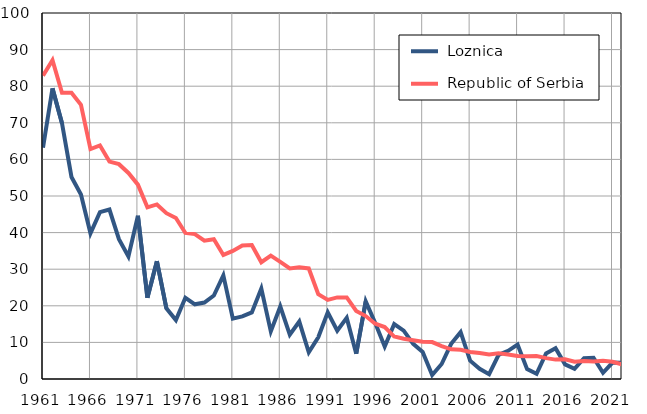
| Category |  Loznica |  Republic of Serbia |
|---|---|---|
| 1961.0 | 63.2 | 82.9 |
| 1962.0 | 79.4 | 87.1 |
| 1963.0 | 69.9 | 78.2 |
| 1964.0 | 55.2 | 78.2 |
| 1965.0 | 50.4 | 74.9 |
| 1966.0 | 39.8 | 62.8 |
| 1967.0 | 45.6 | 63.8 |
| 1968.0 | 46.3 | 59.4 |
| 1969.0 | 38.2 | 58.7 |
| 1970.0 | 33.5 | 56.3 |
| 1971.0 | 44.6 | 53.1 |
| 1972.0 | 22.2 | 46.9 |
| 1973.0 | 32.2 | 47.7 |
| 1974.0 | 19.3 | 45.3 |
| 1975.0 | 16.1 | 44 |
| 1976.0 | 22.2 | 39.9 |
| 1977.0 | 20.4 | 39.6 |
| 1978.0 | 20.9 | 37.8 |
| 1979.0 | 22.8 | 38.2 |
| 1980.0 | 28.3 | 33.9 |
| 1981.0 | 16.5 | 35 |
| 1982.0 | 17.1 | 36.5 |
| 1983.0 | 18.2 | 36.6 |
| 1984.0 | 24.7 | 31.9 |
| 1985.0 | 13 | 33.7 |
| 1986.0 | 19.8 | 32 |
| 1987.0 | 12.1 | 30.2 |
| 1988.0 | 15.7 | 30.5 |
| 1989.0 | 7.3 | 30.2 |
| 1990.0 | 11.4 | 23.2 |
| 1991.0 | 18.2 | 21.6 |
| 1992.0 | 13.2 | 22.3 |
| 1993.0 | 16.7 | 22.3 |
| 1994.0 | 6.9 | 18.6 |
| 1995.0 | 21.2 | 17.2 |
| 1996.0 | 15.3 | 15.1 |
| 1997.0 | 8.9 | 14.2 |
| 1998.0 | 15 | 11.6 |
| 1999.0 | 13.2 | 11 |
| 2000.0 | 9.6 | 10.6 |
| 2001.0 | 7.4 | 10.2 |
| 2002.0 | 1.1 | 10.1 |
| 2003.0 | 4.1 | 9 |
| 2004.0 | 9.6 | 8.1 |
| 2005.0 | 12.8 | 8 |
| 2006.0 | 5 | 7.4 |
| 2007.0 | 2.8 | 7.1 |
| 2008.0 | 1.3 | 6.7 |
| 2009.0 | 6.6 | 7 |
| 2010.0 | 7.7 | 6.7 |
| 2011.0 | 9.4 | 6.3 |
| 2012.0 | 2.7 | 6.2 |
| 2013.0 | 1.4 | 6.3 |
| 2014.0 | 7 | 5.7 |
| 2015.0 | 8.4 | 5.3 |
| 2016.0 | 4 | 5.4 |
| 2017.0 | 2.8 | 4.7 |
| 2018.0 | 5.7 | 4.9 |
| 2019.0 | 5.8 | 4.8 |
| 2020.0 | 1.7 | 5 |
| 2021.0 | 4.5 | 4.7 |
| 2022.0 | 4.4 | 4 |